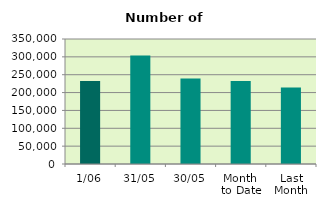
| Category | Series 0 |
|---|---|
| 1/06 | 232682 |
| 31/05 | 303858 |
| 30/05 | 239346 |
| Month 
to Date | 232682 |
| Last
Month | 214383.182 |